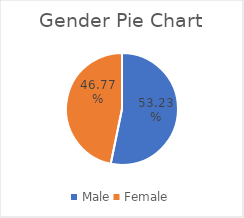
| Category | Series 0 |
|---|---|
| Male | 0.532 |
| Female | 0.468 |